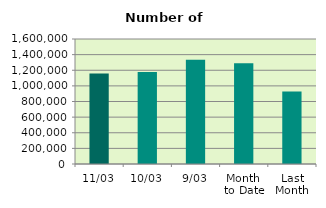
| Category | Series 0 |
|---|---|
| 11/03 | 1157934 |
| 10/03 | 1178066 |
| 9/03 | 1335256 |
| Month 
to Date | 1288518.444 |
| Last
Month | 928647.7 |